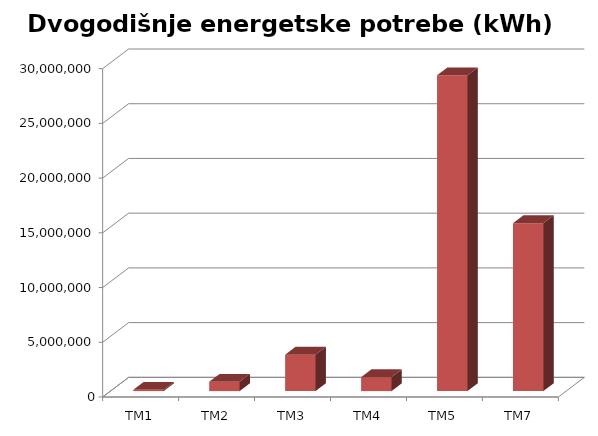
| Category | Dvogodišnje energetske potrebe (kWh) |
|---|---|
| TM1 | 115527 |
| TM2 | 847853 |
| TM3 | 3331952 |
| TM4 | 1268978 |
| TM5 | 28852860 |
| TM7 | 15341486 |